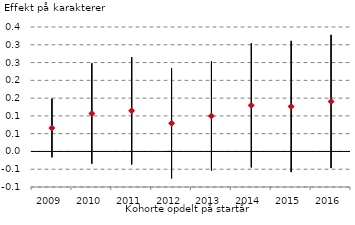
| Category | Øvre 95% | Nedre 95% | Koef. |
|---|---|---|---|
| 2009.0 | 0.149 | -0.017 | 0.066 |
| 2010.0 | 0.248 | -0.035 | 0.107 |
| 2011.0 | 0.266 | -0.037 | 0.114 |
| 2012.0 | 0.234 | -0.076 | 0.079 |
| 2013.0 | 0.253 | -0.054 | 0.1 |
| 2014.0 | 0.304 | -0.045 | 0.13 |
| 2015.0 | 0.311 | -0.058 | 0.126 |
| 2016.0 | 0.328 | -0.047 | 0.141 |